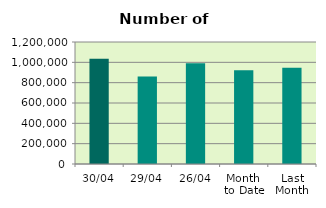
| Category | Series 0 |
|---|---|
| 30/04 | 1034372 |
| 29/04 | 861742 |
| 26/04 | 990184 |
| Month 
to Date | 921109.3 |
| Last
Month | 947588.19 |